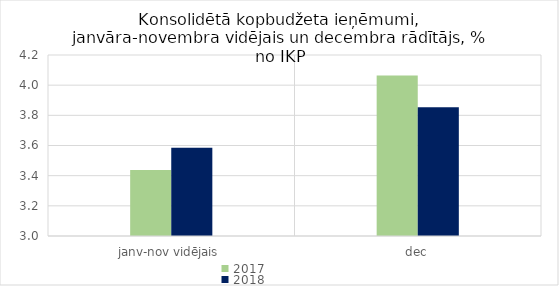
| Category | 2017 | 2018 |
|---|---|---|
| janv-nov vidējais | 3.437 | 3.586 |
| dec | 4.065 | 3.853 |